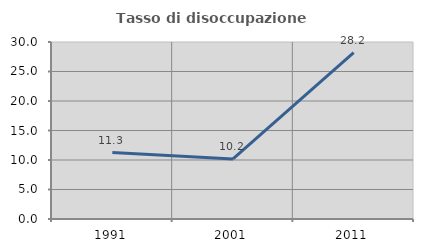
| Category | Tasso di disoccupazione giovanile  |
|---|---|
| 1991.0 | 11.268 |
| 2001.0 | 10.18 |
| 2011.0 | 28.188 |